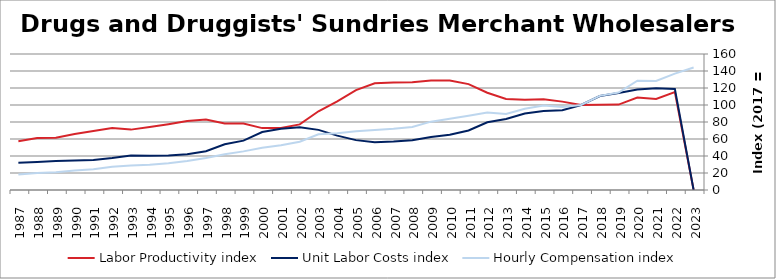
| Category | Labor Productivity index | Unit Labor Costs index | Hourly Compensation index |
|---|---|---|---|
| 2023.0 | 0 | 0 | 144.059 |
| 2022.0 | 115.123 | 118.969 | 136.961 |
| 2021.0 | 107.14 | 119.737 | 128.286 |
| 2020.0 | 108.712 | 118.334 | 128.643 |
| 2019.0 | 100.465 | 114.111 | 114.641 |
| 2018.0 | 100.15 | 110.6 | 110.766 |
| 2017.0 | 100 | 100 | 100 |
| 2016.0 | 103.979 | 93.903 | 97.64 |
| 2015.0 | 106.763 | 93.011 | 99.302 |
| 2014.0 | 106.135 | 90.034 | 95.557 |
| 2013.0 | 107.158 | 83.5 | 89.477 |
| 2012.0 | 114.432 | 79.697 | 91.199 |
| 2011.0 | 124.57 | 70.079 | 87.298 |
| 2010.0 | 128.871 | 64.949 | 83.701 |
| 2009.0 | 128.874 | 62.401 | 80.418 |
| 2008.0 | 126.844 | 58.526 | 74.237 |
| 2007.0 | 126.479 | 56.959 | 72.041 |
| 2006.0 | 125.553 | 56.319 | 70.71 |
| 2005.0 | 117.598 | 58.664 | 68.987 |
| 2004.0 | 104.323 | 63.957 | 66.721 |
| 2003.0 | 92.585 | 70.73 | 65.485 |
| 2002.0 | 77.142 | 73.674 | 56.834 |
| 2001.0 | 72.94 | 72.042 | 52.547 |
| 2000.0 | 72.798 | 68.172 | 49.628 |
| 1999.0 | 78.19 | 58.095 | 45.425 |
| 1998.0 | 78.254 | 53.772 | 42.079 |
| 1997.0 | 82.926 | 45.522 | 37.75 |
| 1996.0 | 81.185 | 42.05 | 34.139 |
| 1995.0 | 77.429 | 40.552 | 31.399 |
| 1994.0 | 74.022 | 40.245 | 29.79 |
| 1993.0 | 71.038 | 40.54 | 28.798 |
| 1992.0 | 72.913 | 37.558 | 27.385 |
| 1991.0 | 69.283 | 35.376 | 24.51 |
| 1990.0 | 65.949 | 34.625 | 22.834 |
| 1989.0 | 61.425 | 34.07 | 20.928 |
| 1988.0 | 61.038 | 32.949 | 20.111 |
| 1987.0 | 57.334 | 31.975 | 18.332 |